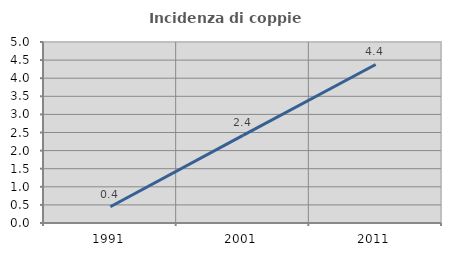
| Category | Incidenza di coppie miste |
|---|---|
| 1991.0 | 0.448 |
| 2001.0 | 2.419 |
| 2011.0 | 4.38 |